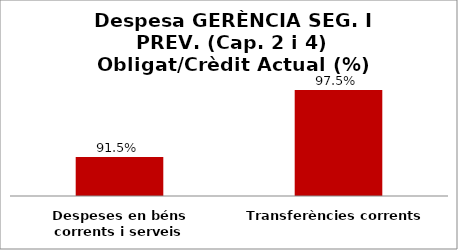
| Category | Series 0 |
|---|---|
| Despeses en béns corrents i serveis | 0.915 |
| Transferències corrents | 0.975 |